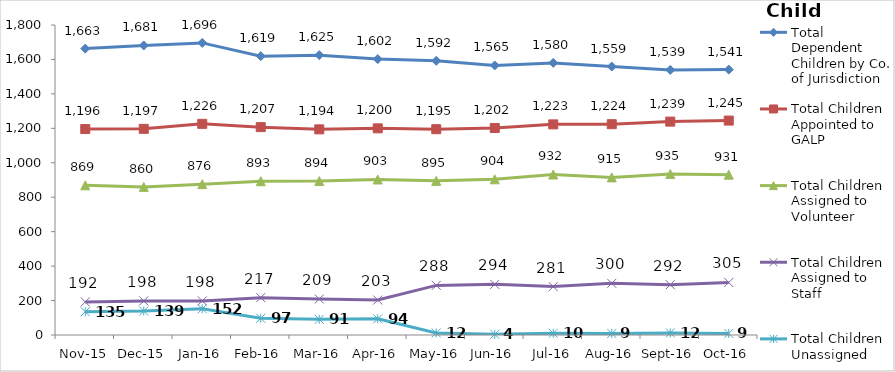
| Category | Total Dependent Children by Co. of Jurisdiction | Total Children Appointed to GALP | Total Children Assigned to Volunteer | Total Children Assigned to Staff | Total Children Unassigned |
|---|---|---|---|---|---|
| Nov-15 | 1663 | 1196 | 869 | 192 | 135 |
| Dec-15 | 1681 | 1197 | 860 | 198 | 139 |
| Jan-16 | 1696 | 1226 | 876 | 198 | 152 |
| Feb-16 | 1619 | 1207 | 893 | 217 | 97 |
| Mar-16 | 1625 | 1194 | 894 | 209 | 91 |
| Apr-16 | 1602 | 1200 | 903 | 203 | 94 |
| May-16 | 1592 | 1195 | 895 | 288 | 12 |
| Jun-16 | 1565 | 1202 | 904 | 294 | 4 |
| Jul-16 | 1580 | 1223 | 932 | 281 | 10 |
| Aug-16 | 1559 | 1224 | 915 | 300 | 9 |
| Sep-16 | 1539 | 1239 | 935 | 292 | 12 |
| Oct-16 | 1541 | 1245 | 931 | 305 | 9 |